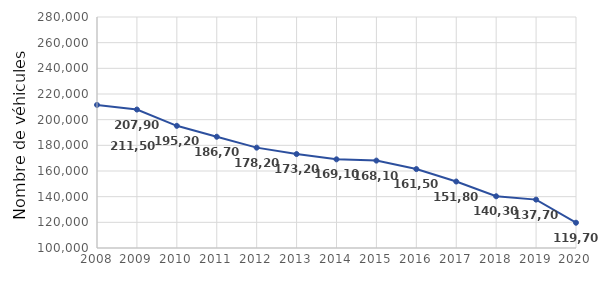
| Category | Series 0 |
|---|---|
| 2008.0 | 211500 |
| 2009.0 | 207900 |
| 2010.0 | 195200 |
| 2011.0 | 186700 |
| 2012.0 | 178200 |
| 2013.0 | 173200 |
| 2014.0 | 169100 |
| 2015.0 | 168100 |
| 2016.0 | 161500 |
| 2017.0 | 151800 |
| 2018.0 | 140300 |
| 2019.0 | 137700 |
| 2020.0 | 119700 |